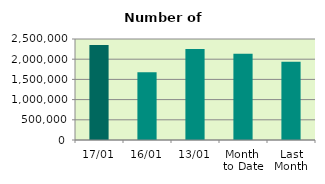
| Category | Series 0 |
|---|---|
| 17/01 | 2352174 |
| 16/01 | 1676482 |
| 13/01 | 2252820 |
| Month 
to Date | 2133914.167 |
| Last
Month | 1934937.048 |